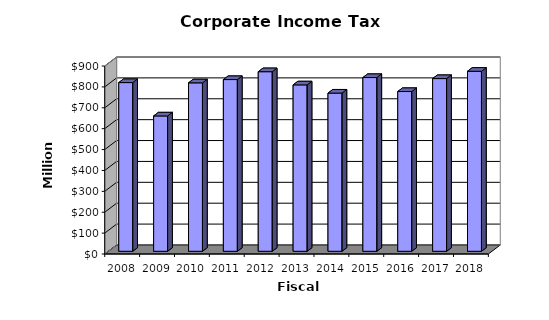
| Category | Amount |
|---|---|
| 2008.0 | 807851584 |
| 2009.0 | 648032537 |
| 2010.0 | 806472760 |
| 2011.0 | 822258802.84 |
| 2012.0 | 859922839.55 |
| 2013.0 | 796728154.4 |
| 2014.0 | 757490742.09 |
| 2015.0 | 831906887.16 |
| 2016.0 | 764948013.77 |
| 2017.0 | 826960822.31 |
| 2018.0 | 861897138.18 |